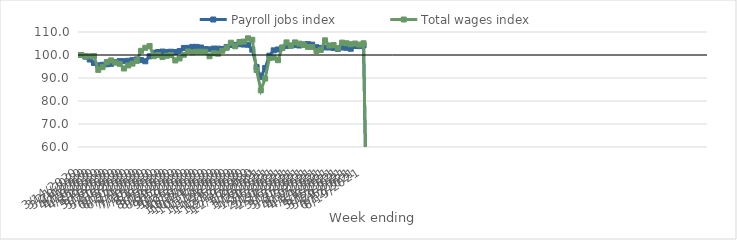
| Category | Payroll jobs index | Total wages index |
|---|---|---|
| 14/03/2020 | 100 | 100 |
| 21/03/2020 | 99.297 | 99.458 |
| 28/03/2020 | 98.037 | 99.423 |
| 04/04/2020 | 96.544 | 99.558 |
| 11/04/2020 | 95.527 | 93.538 |
| 18/04/2020 | 95.746 | 94.716 |
| 25/04/2020 | 95.948 | 96.957 |
| 02/05/2020 | 96.142 | 97.646 |
| 09/05/2020 | 96.922 | 96.697 |
| 16/05/2020 | 97.342 | 96.162 |
| 23/05/2020 | 97.31 | 94.139 |
| 30/05/2020 | 97.486 | 95.451 |
| 06/06/2020 | 97.764 | 96.255 |
| 13/06/2020 | 98.083 | 97.449 |
| 20/06/2020 | 97.792 | 101.816 |
| 27/06/2020 | 97.275 | 103.142 |
| 04/07/2020 | 99.426 | 103.897 |
| 11/07/2020 | 100.984 | 99.495 |
| 18/07/2020 | 101.304 | 99.988 |
| 25/07/2020 | 101.497 | 99.11 |
| 01/08/2020 | 101.344 | 99.664 |
| 08/08/2020 | 101.421 | 99.986 |
| 15/08/2020 | 101.272 | 97.625 |
| 22/08/2020 | 101.706 | 98.5 |
| 29/08/2020 | 103.062 | 100.095 |
| 05/09/2020 | 103.115 | 101.529 |
| 12/09/2020 | 103.538 | 101.162 |
| 19/09/2020 | 103.529 | 101.422 |
| 26/09/2020 | 103.263 | 101.439 |
| 03/10/2020 | 102.56 | 101.384 |
| 10/10/2020 | 102.465 | 99.461 |
| 17/10/2020 | 102.797 | 100.79 |
| 24/10/2020 | 102.771 | 100.566 |
| 31/10/2020 | 102.618 | 101.819 |
| 07/11/2020 | 103.426 | 103.122 |
| 14/11/2020 | 104.381 | 105.341 |
| 21/11/2020 | 104.401 | 103.781 |
| 28/11/2020 | 104.702 | 105.661 |
| 05/12/2020 | 104.544 | 105.846 |
| 12/12/2020 | 104.463 | 107.248 |
| 19/12/2020 | 102.315 | 106.631 |
| 26/12/2020 | 94.77 | 93.497 |
| 02/01/2021 | 90.505 | 84.649 |
| 09/01/2021 | 94.321 | 89.77 |
| 16/01/2021 | 99.708 | 98.698 |
| 23/01/2021 | 102.035 | 98.859 |
| 30/01/2021 | 102.414 | 97.741 |
| 06/02/2021 | 103.159 | 103.243 |
| 13/02/2021 | 103.929 | 105.477 |
| 20/02/2021 | 104.12 | 104.032 |
| 27/02/2021 | 104.288 | 105.478 |
| 06/03/2021 | 104.13 | 104.955 |
| 13/03/2021 | 104.61 | 104.336 |
| 20/03/2021 | 104.736 | 103.503 |
| 27/03/2021 | 104.493 | 103.474 |
| 03/04/2021 | 103.385 | 101.75 |
| 10/04/2021 | 103.027 | 102.217 |
| 17/04/2021 | 103.301 | 106.369 |
| 24/04/2021 | 103.266 | 104.101 |
| 01/05/2021 | 103.076 | 104.317 |
| 08/05/2021 | 102.665 | 102.953 |
| 15/05/2021 | 103.236 | 105.392 |
| 22/05/2021 | 103.134 | 105.107 |
| 29/05/2021 | 102.708 | 104.682 |
| 05/06/2021 | 103.914 | 104.998 |
| 12/06/2021 | 103.859 | 104.524 |
| 19/06/2021 | 104.144 | 105.108 |